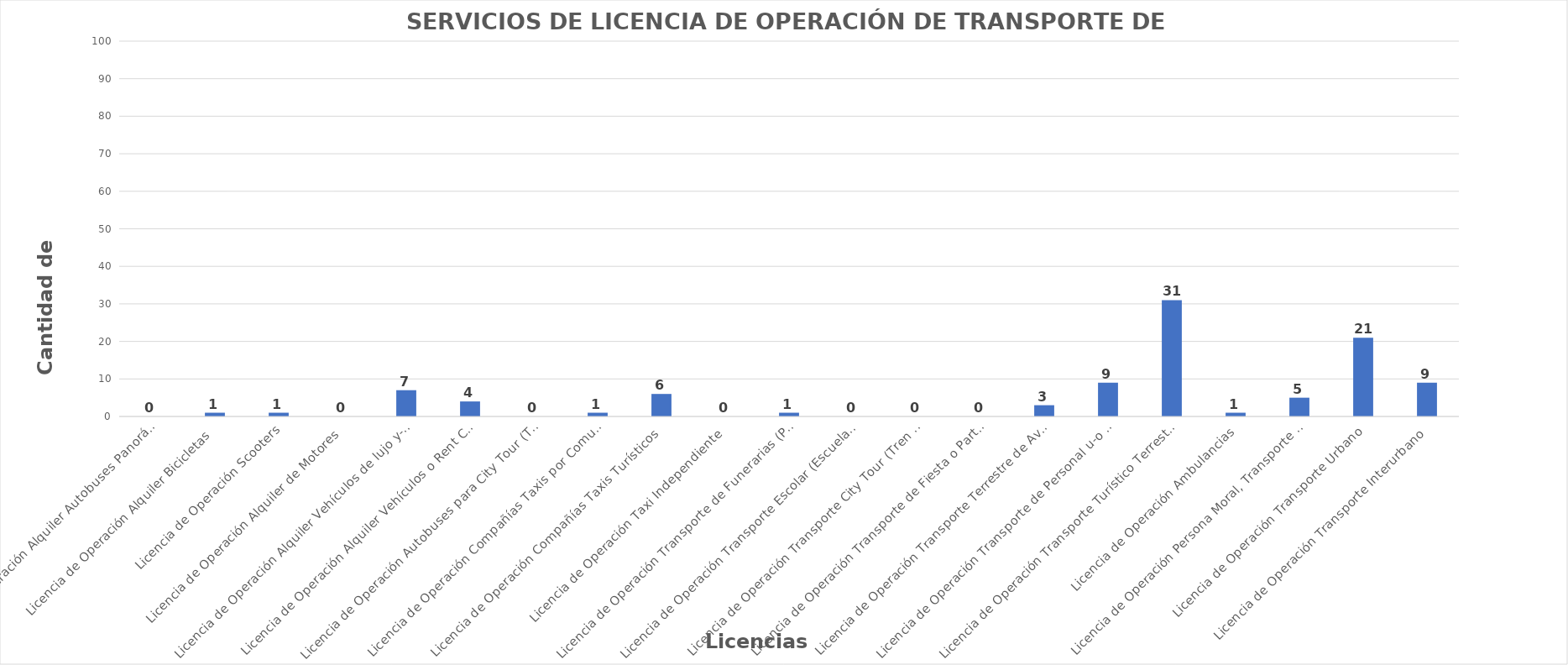
| Category | Series 0 |
|---|---|
| Licencia de Operación Alquiler Autobuses Panorámicos  | 0 |
| Licencia de Operación Alquiler Bicicletas  | 1 |
| Licencia de Operación Scooters | 1 |
| Licencia de Operación Alquiler de Motores  | 0 |
| Licencia de Operación Alquiler Vehículos de lujo y-o Limosina con chofer  | 7 |
| Licencia de Operación Alquiler Vehículos o Rent Car  | 4 |
| Licencia de Operación Autobuses para City Tour (TrolleyBus)  | 0 |
| Licencia de Operación Compañías Taxis por Comunicación  | 1 |
| Licencia de Operación Compañías Taxis Turísticos  | 6 |
| Licencia de Operación Taxi Independiente  | 0 |
| Licencia de Operación Transporte de Funerarias (Persona Física o Moral)  | 1 |
| Licencia de Operación Transporte Escolar (Escuelas Centros Educativos y Universidades)  | 0 |
| Licencia de Operación Transporte City Tour (Tren sobre Ruedas) Persona Física o Moral  | 0 |
| Licencia de Operación Transporte de Fiesta o Party Bus, Persona Física o Moral  | 0 |
| Licencia de Operación Transporte Terrestre de Aventura Camionetas y Camiones y o Jeep Safari Camiones  | 3 |
| Licencia de Operación Transporte de Personal u-o Empresarial  | 9 |
| Licencia de Operación Transporte Turístico Terrestres de Autobuses y Minibuses Persona Física o Moral  | 31 |
| Licencia de Operación Ambulancias | 1 |
| Licencia de Operación Persona Moral, Transporte Turístico Terrestre de Aventura (Four Wheel y Buggy)  | 5 |
| Licencia de Operación Transporte Urbano  | 21 |
| Licencia de Operación Transporte Interurbano  | 9 |